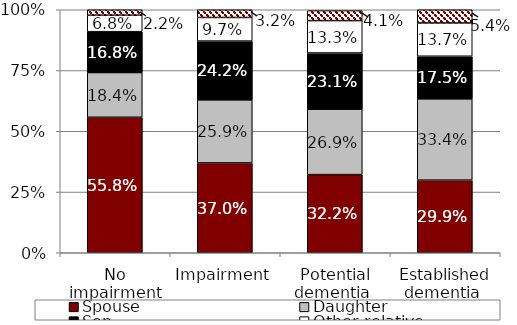
| Category | Spouse  | Daughter | Son  | Other relative | Other nonrelative  |
|---|---|---|---|---|---|
| No impairment | 0.558 | 0.184 | 0.168 | 0.068 | 0.022 |
| Impairment | 0.37 | 0.259 | 0.242 | 0.097 | 0.032 |
| Potential dementia  | 0.322 | 0.269 | 0.231 | 0.133 | 0.041 |
| Established dementia  | 0.299 | 0.334 | 0.175 | 0.137 | 0.054 |